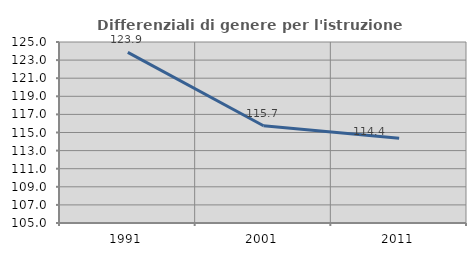
| Category | Differenziali di genere per l'istruzione superiore |
|---|---|
| 1991.0 | 123.859 |
| 2001.0 | 115.744 |
| 2011.0 | 114.376 |